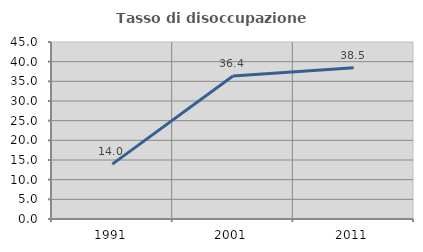
| Category | Tasso di disoccupazione giovanile  |
|---|---|
| 1991.0 | 13.953 |
| 2001.0 | 36.364 |
| 2011.0 | 38.462 |